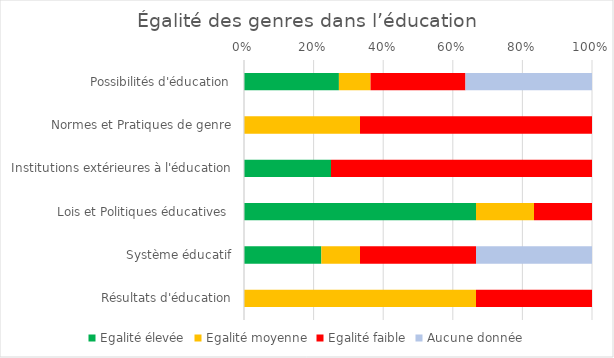
| Category | Egalité élevée | Egalité moyenne | Egalité faible | Aucune donnée |
|---|---|---|---|---|
| Possibilités d'éducation | 3 | 1 | 3 | 4 |
| Normes et Pratiques de genre | 0 | 1 | 2 | 0 |
| Institutions extérieures à l'éducation | 1 | 0 | 3 | 0 |
| Lois et Politiques éducatives  | 4 | 1 | 1 | 0 |
| Système éducatif | 2 | 1 | 3 | 3 |
| Résultats d'éducation | 0 | 2 | 1 | 0 |